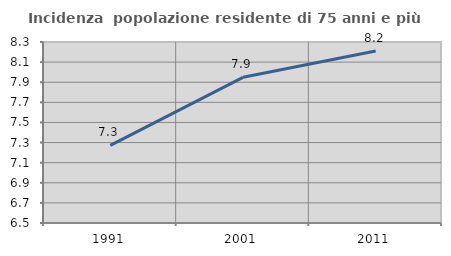
| Category | Incidenza  popolazione residente di 75 anni e più |
|---|---|
| 1991.0 | 7.273 |
| 2001.0 | 7.949 |
| 2011.0 | 8.211 |